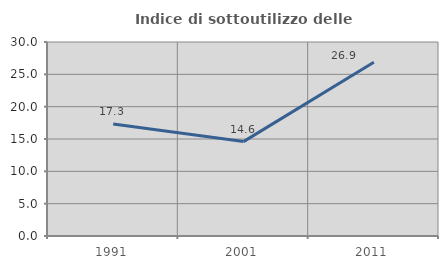
| Category | Indice di sottoutilizzo delle abitazioni  |
|---|---|
| 1991.0 | 17.32 |
| 2001.0 | 14.599 |
| 2011.0 | 26.877 |